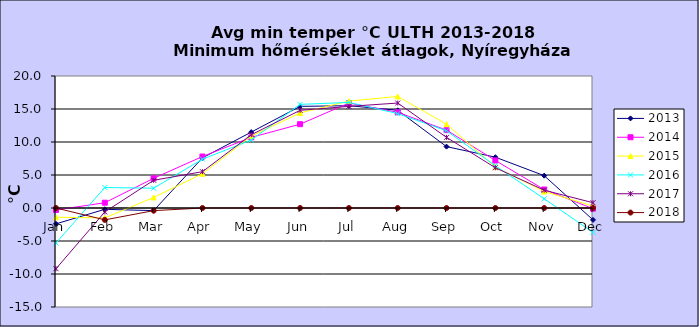
| Category | 2013 | 2014 | 2015 | 2016 | 2017 | 2018 |
|---|---|---|---|---|---|---|
| Jan | -2.4 | -0.3 | -1.4 | -5.3 | -9.2 | 0 |
| Feb | -0.2 | 0.8 | -1.5 | 3.1 | -0.6 | -1.8 |
| Mar | -0.4 | 4.5 | 1.6 | 3 | 4.2 | -0.4 |
| Apr | 7.6 | 7.8 | 5.2 | 7.4 | 5.5 | 0 |
| May | 11.5 | 10.7 | 10.9 | 10.3 | 11.1 | 0 |
| Jun | 15.4 | 12.7 | 14.4 | 15.7 | 14.8 | 0 |
| Jul | 15.5 | 15.9 | 16.2 | 16 | 15.4 | 0 |
| Aug | 14.8 | 14.5 | 16.9 | 14.3 | 15.9 | 0 |
| Sep | 9.3 | 11.8 | 12.7 | 11.7 | 10.7 | 0 |
| Oct | 7.7 | 7.2 | 6.2 | 6.4 | 6.1 | 0 |
| Nov | 4.9 | 2.8 | 2.5 | 1.4 | 2.7 | 0 |
| Dec | -1.8 | -0.1 | 0.3 | -3.7 | 0.8 | 0 |